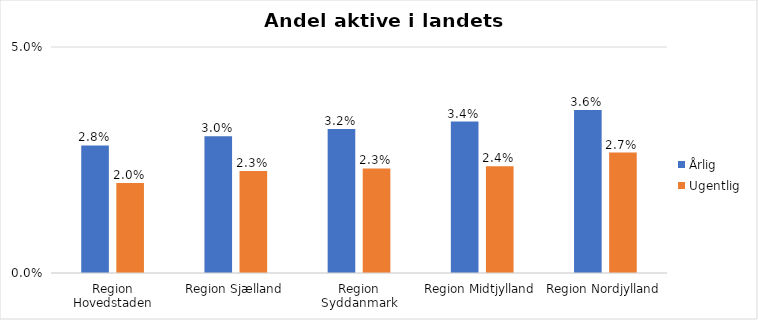
| Category | Årlig | Ugentlig |
|---|---|---|
| Region Hovedstaden | 0.028 | 0.02 |
| Region Sjælland | 0.03 | 0.023 |
| Region Syddanmark | 0.032 | 0.023 |
| Region Midtjylland | 0.034 | 0.024 |
| Region Nordjylland | 0.036 | 0.027 |